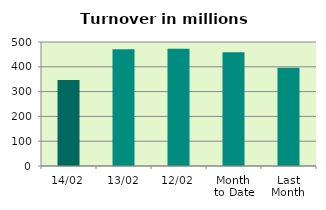
| Category | Series 0 |
|---|---|
| 14/02 | 346.967 |
| 13/02 | 471.099 |
| 12/02 | 472.633 |
| Month 
to Date | 458.579 |
| Last
Month | 396.049 |